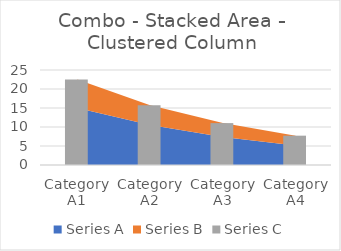
| Category | Series C |
|---|---|
| Category A1 | 22.5 |
| Category A2 | 15.75 |
| Category A3 | 11.025 |
| Category A4 | 7.717 |